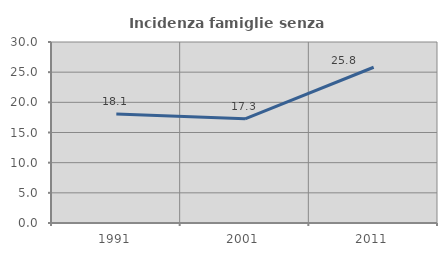
| Category | Incidenza famiglie senza nuclei |
|---|---|
| 1991.0 | 18.068 |
| 2001.0 | 17.27 |
| 2011.0 | 25.812 |